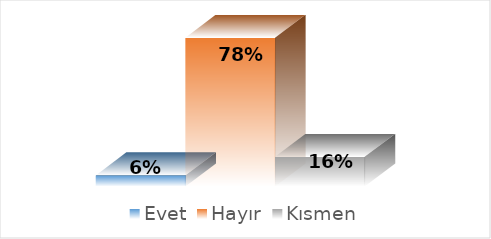
| Category | Evet | Hayır | Kısmen |
|---|---|---|---|
| 0 | 0.059 | 0.784 | 0.157 |